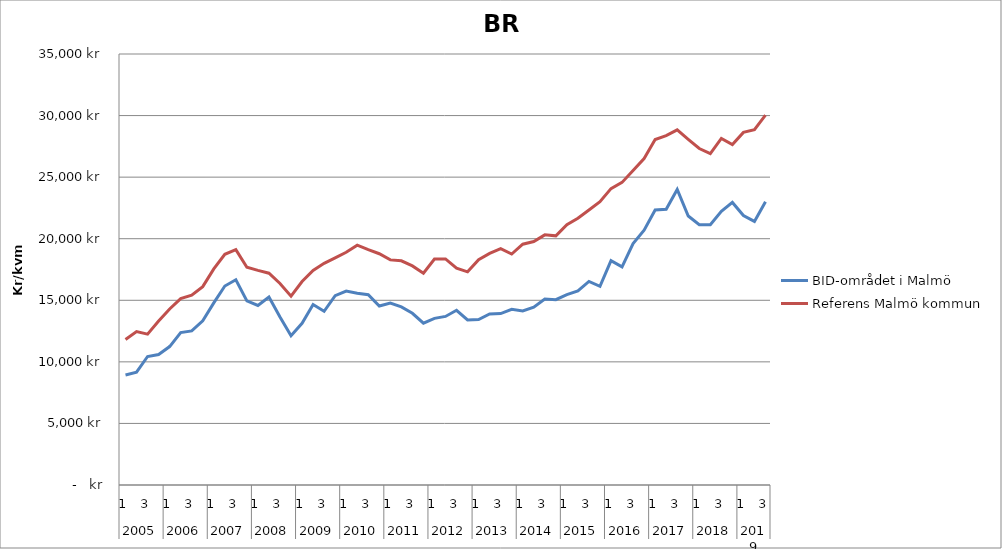
| Category | BID-området i Malmö | Referens Malmö kommun |
|---|---|---|
| 0 | 8932.839 | 11819.039 |
| 1 | 9168.062 | 12463.844 |
| 2 | 10434.734 | 12252.94 |
| 3 | 10597.541 | 13312.122 |
| 4 | 11240.924 | 14294.537 |
| 5 | 12373.551 | 15141.292 |
| 6 | 12512.831 | 15412.157 |
| 7 | 13326.6 | 16108.531 |
| 8 | 14787.578 | 17546.245 |
| 9 | 16157.477 | 18733.259 |
| 10 | 16663.473 | 19114.501 |
| 11 | 14948.507 | 17685.912 |
| 12 | 14581.468 | 17425.419 |
| 13 | 15264.848 | 17200.269 |
| 14 | 13644.396 | 16363.265 |
| 15 | 12128.836 | 15329.078 |
| 16 | 13128.143 | 16521.049 |
| 17 | 14659.691 | 17424.867 |
| 18 | 14109.685 | 18000.251 |
| 19 | 15372.663 | 18444.653 |
| 20 | 15742.036 | 18902.092 |
| 21 | 15568.61 | 19479.615 |
| 22 | 15447.788 | 19112.607 |
| 23 | 14535.018 | 18780.836 |
| 24 | 14770.263 | 18280.404 |
| 25 | 14460.27 | 18204.01 |
| 26 | 13946.452 | 17793.431 |
| 27 | 13145.293 | 17202.258 |
| 28 | 13533.269 | 18354.302 |
| 29 | 13688.183 | 18357.848 |
| 30 | 14191.029 | 17601.665 |
| 31 | 13406.405 | 17308.257 |
| 32 | 13429.803 | 18294.959 |
| 33 | 13885.542 | 18806.957 |
| 34 | 13924.31 | 19198.84 |
| 35 | 14264.842 | 18758.317 |
| 36 | 14137.191 | 19556.088 |
| 37 | 14444.5 | 19772.193 |
| 38 | 15101.985 | 20312.836 |
| 39 | 15048.365 | 20234.008 |
| 40 | 15465.506 | 21133.176 |
| 41 | 15765.089 | 21664.346 |
| 42 | 16529.833 | 22333.62 |
| 43 | 16129.44 | 23002.459 |
| 44 | 18216.371 | 24067.172 |
| 45 | 17713.874 | 24571.124 |
| 46 | 19606.747 | 25533.078 |
| 47 | 20690.478 | 26512.718 |
| 48 | 22336.699 | 28053.027 |
| 49 | 22393 | 28367.218 |
| 50 | 23993.663 | 28840.634 |
| 51 | 21845.167 | 28074.406 |
| 52 | 21142.544 | 27324.856 |
| 53 | 21143.093 | 26907.413 |
| 54 | 22218.853 | 28140.266 |
| 55 | 22945.128 | 27644.882 |
| 56 | 21879.653 | 28635.238 |
| 57 | 21403.193 | 28852.991 |
| 58 | 23004.673 | 30030.563 |